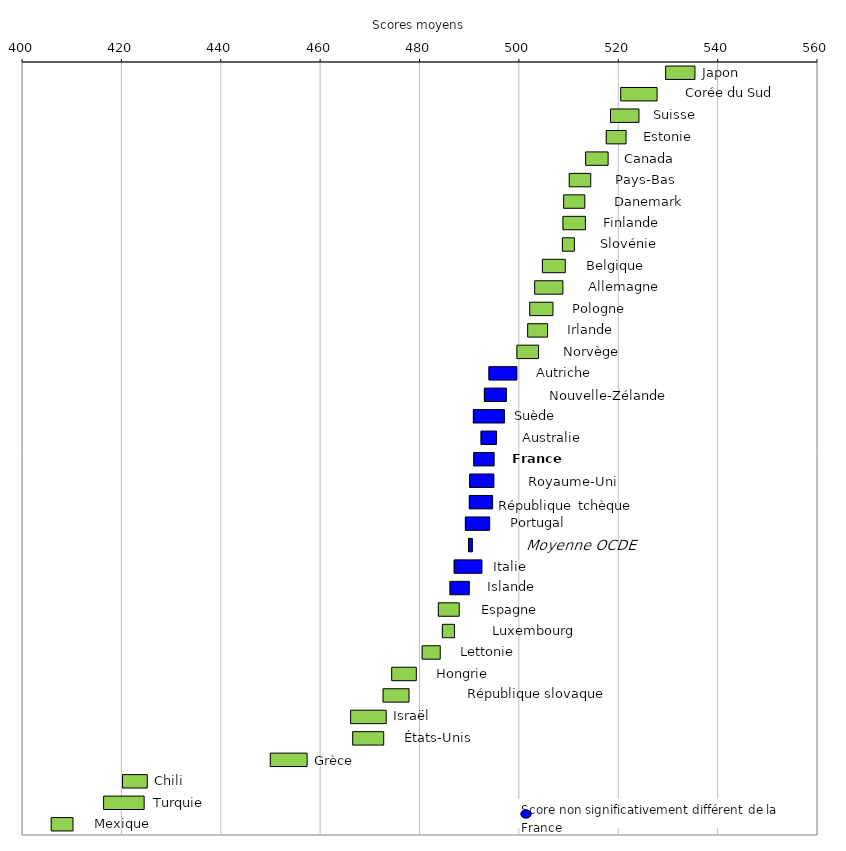
| Category | Series 0 | Series 1 | Series 2 |
|---|---|---|---|
| Japon | 529.44 | 6 |  |
| Corée du Sud | 520.394 | 7.425 |  |
| Suisse | 518.33 | 5.841 |  |
| Estonie | 517.487 | 4.085 |  |
| Canada | 513.334 | 4.626 |  |
| Pays-Bas | 510.041 | 4.423 |  |
| Danemark | 508.913 | 4.348 |  |
| Finlande | 508.768 | 4.619 |  |
| Slovénie | 508.663 | 2.513 |  |
| Belgique | 504.634 | 4.701 |  |
| Allemagne | 503.083 | 5.776 |  |
| Pologne | 502.079 | 4.78 |  |
| Irlande | 501.669 | 4.106 |  |
| Norvège | 499.498 | 4.463 |  |
| Autriche | 493.881 | 5.722 |  |
| Nouvelle-Zélande | 492.958 | 4.531 |  |
| Suède | 490.746 | 6.345 |  |
| Australie | 492.291 | 3.211 |  |
| France | 490.822 | 4.198 |  |
| Royaume-Uni | 489.982 | 4.993 |  |
| Rép. tchèque | 489.929 | 4.792 |  |
| Portugal | 489.136 | 4.982 |  |
| Moyenne OCDE | 489.765 | 0.877 |  |
| Italie | 486.883 | 5.691 |  |
| Islande | 486.045 | 3.977 |  |
| Espagne | 483.692 | 4.302 |  |
| Luxembourg | 484.503 | 2.536 |  |
| Lettonie | 480.436 | 3.737 |  |
| Hongrie | 474.304 | 5.054 |  |
| Rép. slovaque | 472.572 | 5.317 |  |
| Israël | 466.04 | 7.258 |  |
| États-Unis | 466.462 | 6.333 |  |
| Grèce | 449.876 | 7.507 |  |
| Chili | 420.132 | 5.079 |  |
| Turquie | 416.325 | 8.258 |  |
| Mexique | 405.783 | 4.482 |  |